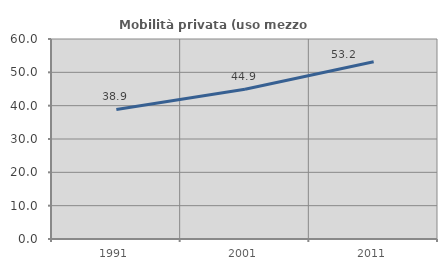
| Category | Mobilità privata (uso mezzo privato) |
|---|---|
| 1991.0 | 38.854 |
| 2001.0 | 44.944 |
| 2011.0 | 53.157 |